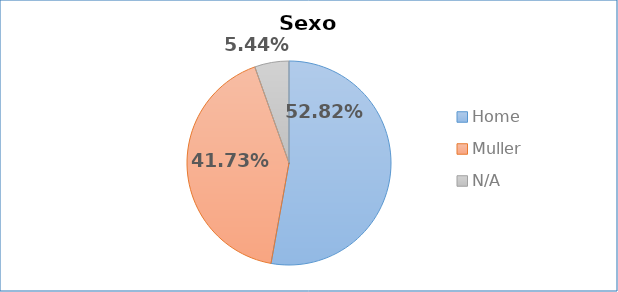
| Category | Sexo |
|---|---|
| Home | 0.528 |
| Muller | 0.417 |
| N/A | 0.054 |